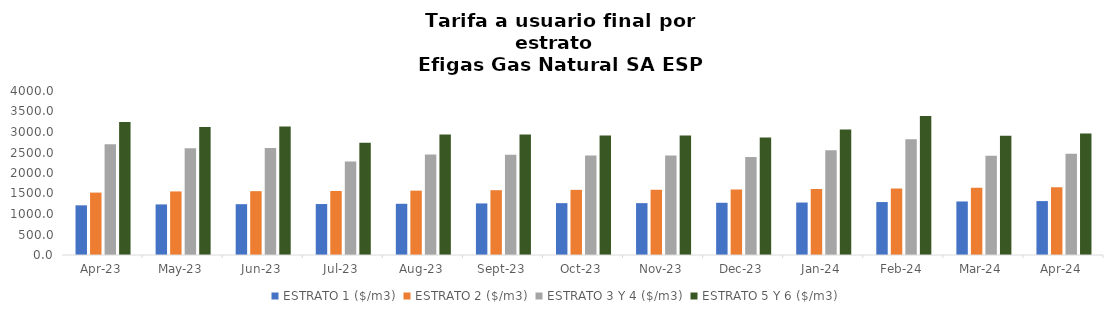
| Category | ESTRATO 1 ($/m3) | ESTRATO 2 ($/m3) | ESTRATO 3 Y 4 ($/m3) | ESTRATO 5 Y 6 ($/m3) |
|---|---|---|---|---|
| 2023-04-01 | 1211.66 | 1522.37 | 2701.57 | 3241.884 |
| 2023-05-01 | 1233.96 | 1550.39 | 2603.83 | 3124.596 |
| 2023-06-01 | 1239.35 | 1557.16 | 2610.15 | 3132.18 |
| 2023-07-01 | 1243.07 | 1561.83 | 2281.753 | 2738.104 |
| 2023-08-01 | 1249.3 | 1569.65 | 2451.116 | 2941.34 |
| 2023-09-01 | 1258.03 | 1580.63 | 2447.703 | 2937.244 |
| 2023-10-01 | 1264.72 | 1589.03 | 2427.174 | 2912.609 |
| 2023-11-01 | 1264.72 | 1589.03 | 2427.174 | 2912.609 |
| 2023-12-01 | 1273.83 | 1600.47 | 2388.722 | 2866.466 |
| 2024-01-01 | 1279.68 | 1607.83 | 2553.12 | 3063.744 |
| 2024-02-01 | 1291.39 | 1622.54 | 2824.404 | 3389.285 |
| 2024-03-01 | 1305.42 | 1640.17 | 2423.603 | 2908.324 |
| 2024-04-01 | 1314.62 | 1651.73 | 2467.942 | 2961.53 |